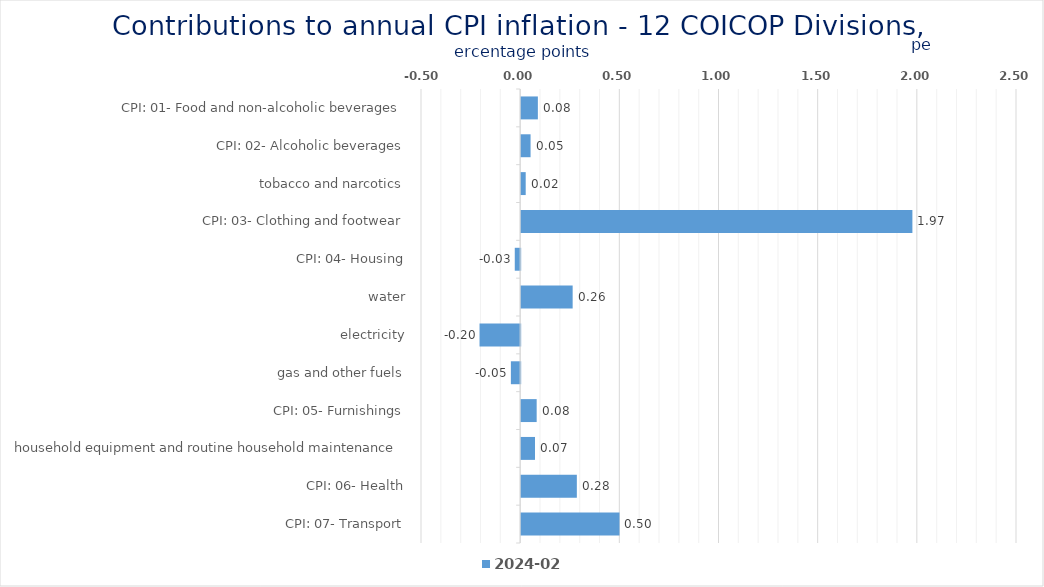
| Category | 2024-02 |
|---|---|
| CPI: 01- Food and non-alcoholic beverages | 0.084 |
| CPI: 02- Alcoholic beverages, tobacco and narcotics | 0.047 |
| CPI: 03- Clothing and footwear | 0.023 |
| CPI: 04- Housing, water, electricity, gas and other fuels | 1.973 |
| CPI: 05- Furnishings, household equipment and routine household maintenance | -0.027 |
| CPI: 06- Health | 0.26 |
| CPI: 07- Transport | -0.205 |
| CPI: 08- Communication | -0.047 |
| CPI: 09- Recreation and culture | 0.078 |
| CPI: 10- Education | 0.07 |
| CPI: 11- Restaurants and hotels | 0.281 |
| CPI: 12- Miscellaneous goods and services | 0.496 |